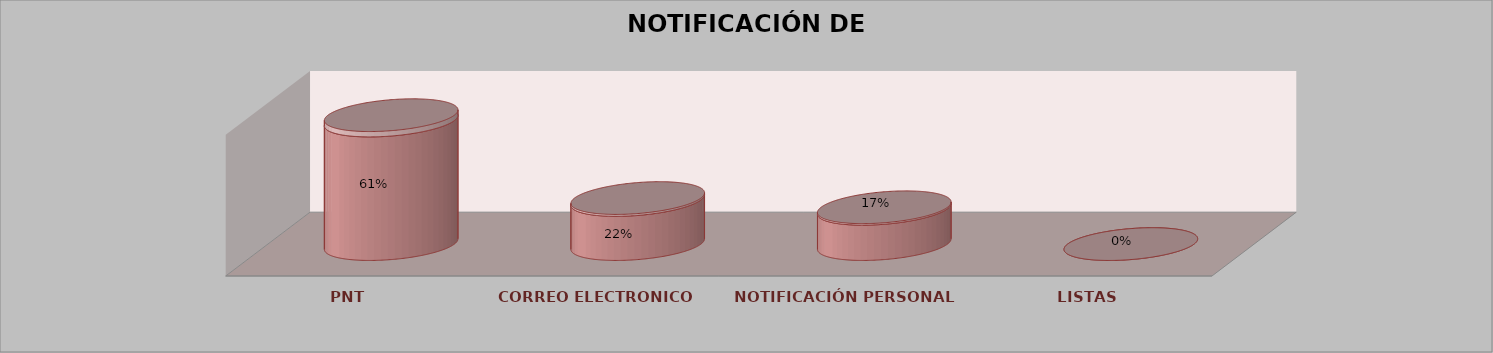
| Category | Series 0 | Series 1 | Series 2 | Series 3 | Series 4 |
|---|---|---|---|---|---|
| PNT |  |  |  | 14 | 0.609 |
| CORREO ELECTRONICO |  |  |  | 5 | 0.217 |
| NOTIFICACIÓN PERSONAL |  |  |  | 4 | 0.174 |
| LISTAS |  |  |  | 0 | 0 |